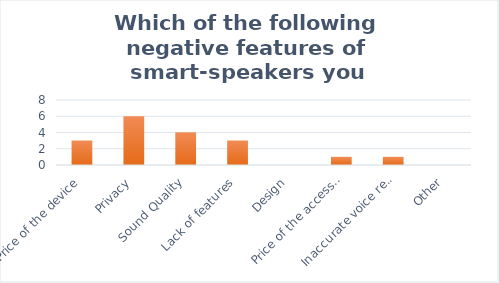
| Category | Series 0 |
|---|---|
| Price of the device | 3 |
| Privacy | 6 |
| Sound Quality | 4 |
| Lack of features | 3 |
| Design | 0 |
| Price of the accessories | 1 |
| Inaccurate voice recognition | 1 |
| Other | 0 |